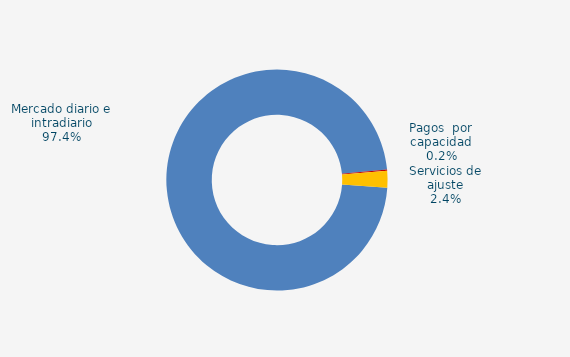
| Category | Series 0 |
|---|---|
| Mercado diario e intradiario | 156.53 |
| Pagos  por capacidad | 0.31 |
| Servicio interrumpibilidad | 0 |
| Servicios de ajuste | 3.92 |